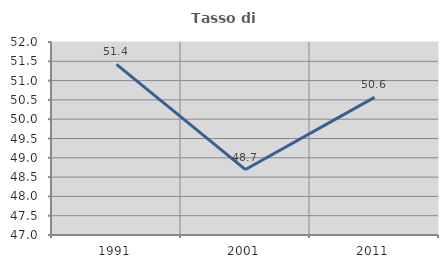
| Category | Tasso di occupazione   |
|---|---|
| 1991.0 | 51.421 |
| 2001.0 | 48.695 |
| 2011.0 | 50.564 |